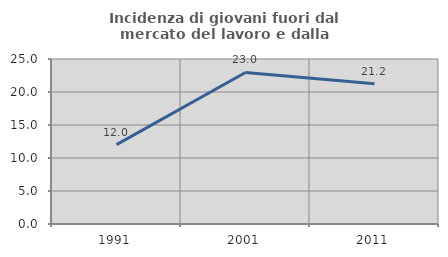
| Category | Incidenza di giovani fuori dal mercato del lavoro e dalla formazione  |
|---|---|
| 1991.0 | 12.023 |
| 2001.0 | 22.963 |
| 2011.0 | 21.239 |